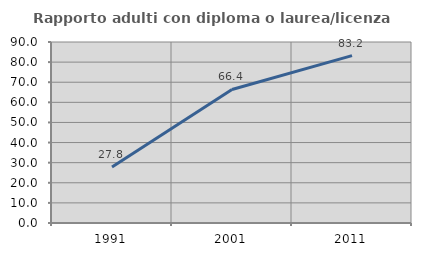
| Category | Rapporto adulti con diploma o laurea/licenza media  |
|---|---|
| 1991.0 | 27.835 |
| 2001.0 | 66.406 |
| 2011.0 | 83.217 |